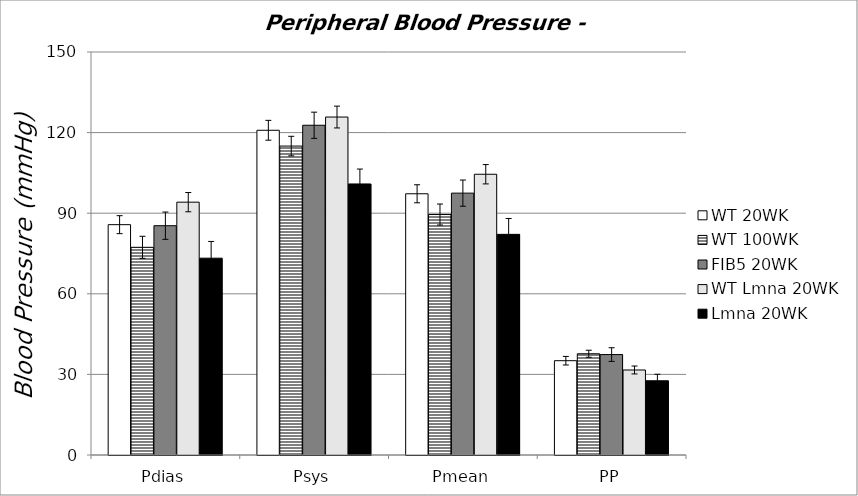
| Category | WT 20WK | WT 100WK | FIB5 20WK | WT Lmna 20WK | Lmna 20WK |
|---|---|---|---|---|---|
| Pdias | 85.733 | 77.301 | 85.351 | 94.106 | 73.258 |
| Psys | 120.869 | 114.985 | 122.731 | 125.791 | 100.888 |
| Pmean | 97.229 | 89.501 | 97.469 | 104.497 | 82.125 |
| PP | 35.099 | 37.683 | 37.379 | 31.643 | 27.63 |